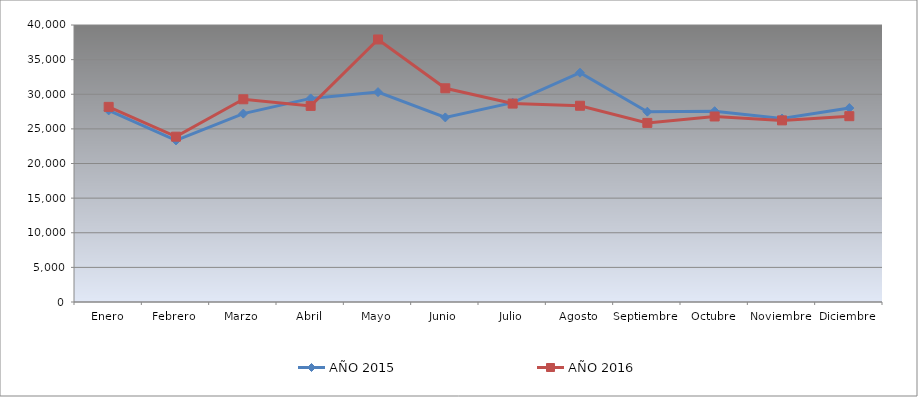
| Category | AÑO 2015 | AÑO 2016 |
|---|---|---|
| Enero | 27666.294 | 28178.131 |
| Febrero | 23332.405 | 23874.25 |
| Marzo | 27202.873 | 29274.306 |
| Abril | 29399.159 | 28317.41 |
| Mayo | 30308.74 | 37912.161 |
| Junio | 26655.743 | 30862.254 |
| Julio | 28783.853 | 28651.851 |
| Agosto | 33113.427 | 28341.483 |
| Septiembre | 27482.479 | 25862.839 |
| Octubre | 27555.832 | 26789.644 |
| Noviembre | 26489.188 | 26226.511 |
| Diciembre | 28008.034 | 26833.491 |